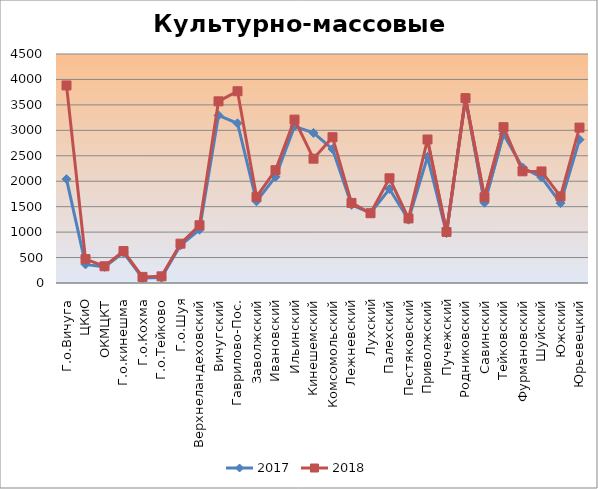
| Category | 2017 | 2018 |
|---|---|---|
| Г.о.Вичуга | 2040 | 3882 |
| ЦКиО | 366 | 470 |
| ОКМЦКТ | 317 | 329 |
| Г.о.кинешма | 598 | 628 |
| Г.о.Кохма | 97 | 120 |
| Г.о.Тейково | 106 | 131 |
| Г.о.Шуя | 741 | 773 |
| Верхнеландеховский | 1047 | 1135 |
| Вичугский | 3294 | 3570 |
| Гаврилово-Пос. | 3139 | 3768 |
| Заволжский | 1605 | 1693 |
| Ивановский | 2086 | 2217 |
| Ильинский | 3078 | 3211 |
| Кинешемский | 2949 | 2443 |
| Комсомольский | 2633 | 2865 |
| Лежневский | 1537 | 1574 |
| Лухский | 1375 | 1371 |
| Палехский | 1846 | 2058 |
| Пестяковский | 1243 | 1269 |
| Приволжский | 2480 | 2820 |
| Пучежский | 979 | 1004 |
| Родниковский | 3630 | 3632 |
| Савинский | 1577 | 1685 |
| Тейковский | 2924 | 3062 |
| Фурмановский | 2270 | 2195 |
| Шуйский | 2074 | 2192 |
| Южский | 1570 | 1702 |
| Юрьевецкий | 2818 | 3054 |